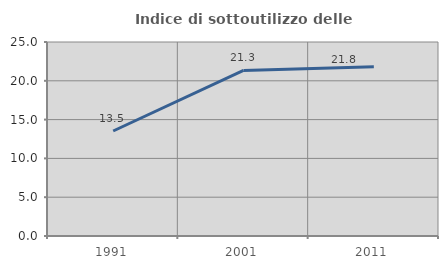
| Category | Indice di sottoutilizzo delle abitazioni  |
|---|---|
| 1991.0 | 13.533 |
| 2001.0 | 21.336 |
| 2011.0 | 21.819 |